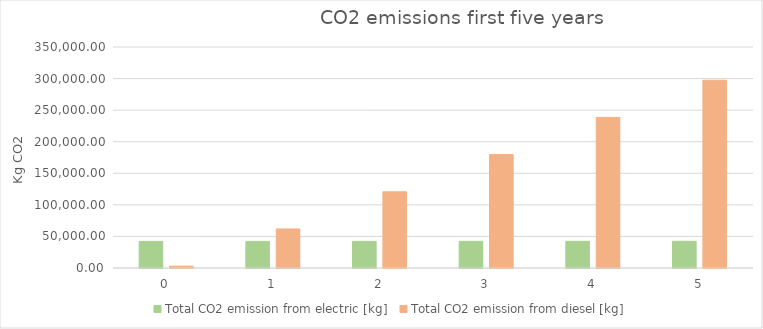
| Category | Total CO2 emission from electric [kg] | Total CO2 emission from diesel [kg] |
|---|---|---|
| 0.0 | 42116.765 | 2931.921 |
| 1.0 | 42151.684 | 61819.032 |
| 2.0 | 42186.603 | 120706.143 |
| 3.0 | 42221.522 | 179593.255 |
| 4.0 | 42256.441 | 238480.366 |
| 5.0 | 42291.36 | 297367.477 |